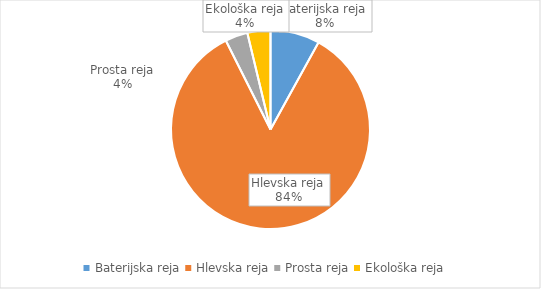
| Category | Količina kosov jajc |
|---|---|
| Baterijska reja | 262914 |
| Hlevska reja | 2772925 |
| Prosta reja | 119863 |
| Ekološka reja | 122920 |